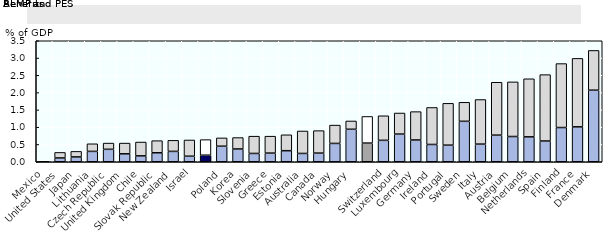
| Category | ALMP and PES | Benefits |
|---|---|---|
| Mexico | 0.01 | 0 |
| United States | 0.11 | 0.16 |
| Japan | 0.14 | 0.16 |
| Lithuania | 0.3 | 0.22 |
| Czech Republic | 0.36 | 0.18 |
| United Kingdom | 0.23 | 0.31 |
| Chile | 0.17 | 0.4 |
| Slovak Republic | 0.26 | 0.35 |
| New Zealand | 0.3 | 0.32 |
| Israel | 0.16 | 0.47 |
|  | 0.19 | 0.45 |
| Poland | 0.45 | 0.24 |
| Korea | 0.37 | 0.33 |
| Slovenia | 0.24 | 0.5 |
| Greece | 0.25 | 0.49 |
| Estonia | 0.32 | 0.46 |
| Australia | 0.24 | 0.65 |
| Canada | 0.25 | 0.65 |
| Norway | 0.53 | 0.53 |
| Hungary | 0.94 | 0.24 |
|  | 0.54 | 0.77 |
| Switzerland | 0.62 | 0.71 |
| Luxembourg | 0.8 | 0.61 |
| Germany | 0.63 | 0.82 |
| Ireland | 0.5 | 1.07 |
| Portugal | 0.48 | 1.21 |
| Sweden | 1.17 | 0.55 |
| Italy | 0.51 | 1.29 |
| Austria | 0.77 | 1.53 |
| Belgium | 0.73 | 1.58 |
| Netherlands | 0.72 | 1.68 |
| Spain | 0.6 | 1.92 |
| Finland | 0.99 | 1.85 |
| France | 1.01 | 1.98 |
| Denmark | 2.07 | 1.15 |